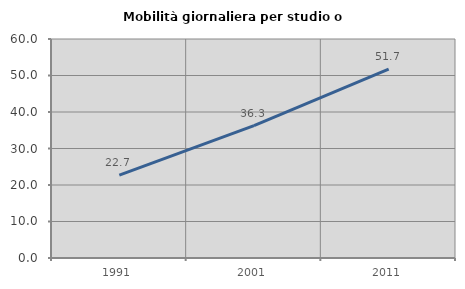
| Category | Mobilità giornaliera per studio o lavoro |
|---|---|
| 1991.0 | 22.703 |
| 2001.0 | 36.29 |
| 2011.0 | 51.724 |